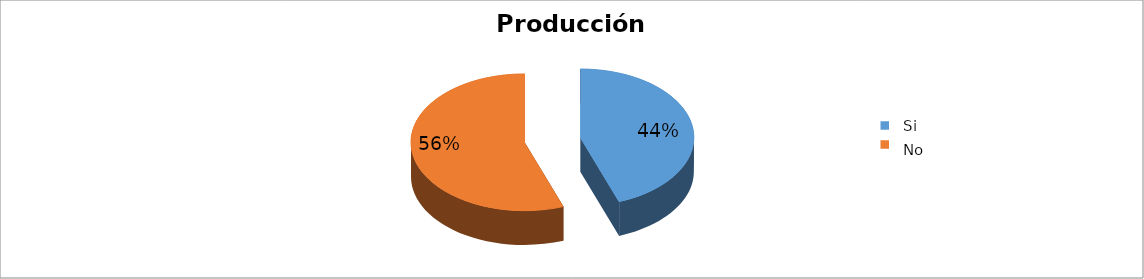
| Category | Series 0 |
|---|---|
| 0 | 0.444 |
| 1 | 0.556 |